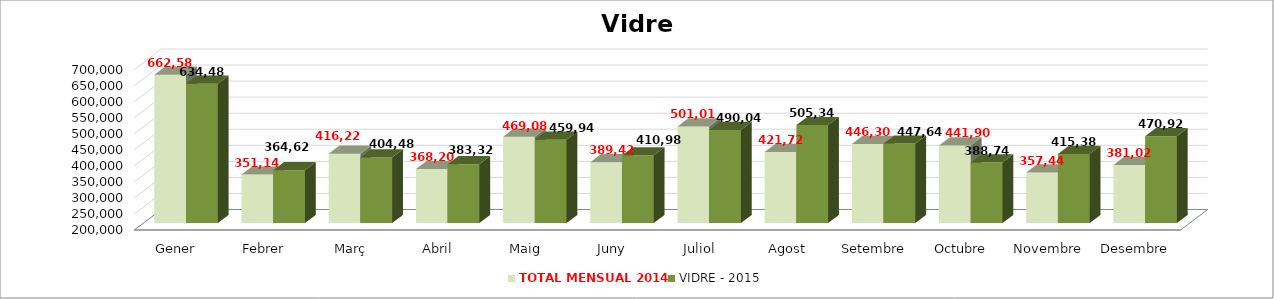
| Category | TOTAL MENSUAL 2014 | VIDRE - 2015 |
|---|---|---|
| Gener | 662579.98 | 634479.98 |
| Febrer | 351140.01 | 364620.04 |
| Març | 416220.01 | 404480.01 |
| Abril | 368200.03 | 383320.02 |
| Maig | 469079.98 | 459940 |
| Juny | 389419.74 | 410980 |
| Juliol | 501010 | 490040.03 |
| Agost | 421720 | 505339.87 |
| Setembre | 446300 | 447640.03 |
| Octubre | 441900 | 388740.07 |
| Novembre | 357440 | 415380.01 |
| Desembre | 381019.96 | 470920.03 |